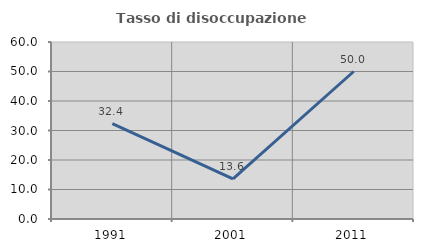
| Category | Tasso di disoccupazione giovanile  |
|---|---|
| 1991.0 | 32.353 |
| 2001.0 | 13.636 |
| 2011.0 | 50 |